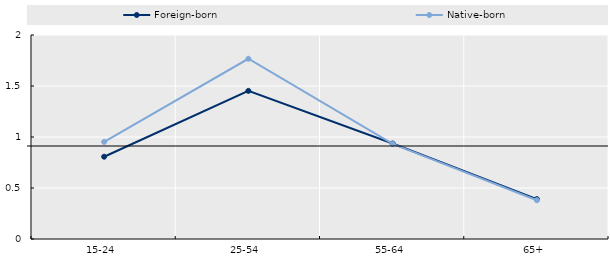
| Category | Foreign-born | Native-born |
|---|---|---|
| 15-24 | 0.807 | 0.952 |
| 25-54 | 1.452 | 1.767 |
| 55-64 | 0.936 | 0.932 |
| 65+ | 0.391 | 0.38 |